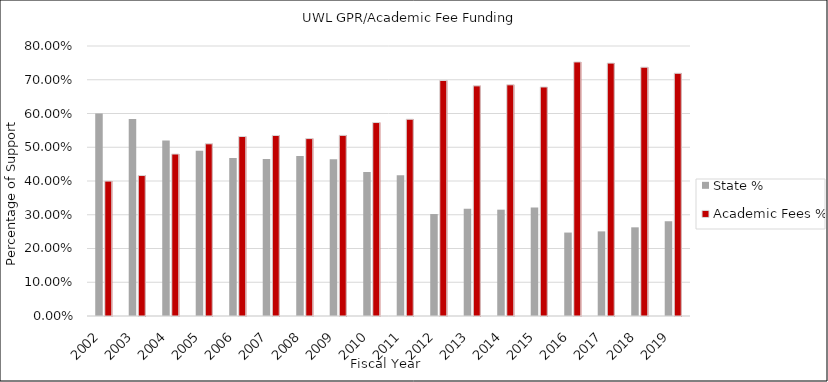
| Category | State % | Academic Fees % |
|---|---|---|
| 2002.0 | 0.6 | 0.4 |
| 2003.0 | 0.584 | 0.416 |
| 2004.0 | 0.52 | 0.48 |
| 2005.0 | 0.49 | 0.51 |
| 2006.0 | 0.468 | 0.532 |
| 2007.0 | 0.465 | 0.535 |
| 2008.0 | 0.474 | 0.526 |
| 2009.0 | 0.465 | 0.535 |
| 2010.0 | 0.427 | 0.573 |
| 2011.0 | 0.417 | 0.583 |
| 2012.0 | 0.302 | 0.698 |
| 2013.0 | 0.318 | 0.682 |
| 2014.0 | 0.315 | 0.685 |
| 2015.0 | 0.321 | 0.679 |
| 2016.0 | 0.247 | 0.753 |
| 2017.0 | 0.251 | 0.749 |
| 2018.0 | 0.263 | 0.737 |
| 2019.0 | 0.281 | 0.719 |